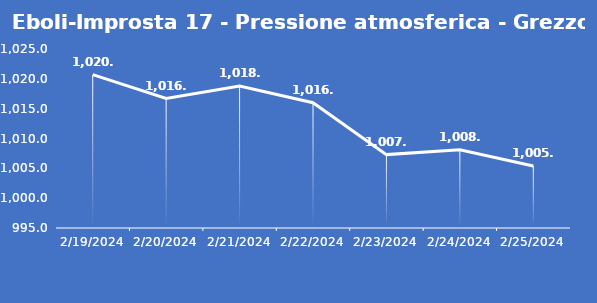
| Category | Eboli-Improsta 17 - Pressione atmosferica - Grezzo (hPa) |
|---|---|
| 2/19/24 | 1020.7 |
| 2/20/24 | 1016.7 |
| 2/21/24 | 1018.8 |
| 2/22/24 | 1016 |
| 2/23/24 | 1007.3 |
| 2/24/24 | 1008.1 |
| 2/25/24 | 1005.4 |